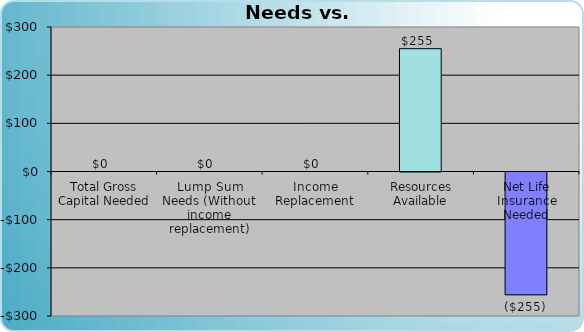
| Category | Series 0 |
|---|---|
| Total Gross Capital Needed | 0 |
| Lump Sum Needs (Without income replacement) | 0 |
| Income Replacement | 0 |
| Resources Available | 255 |
| Net Life Insurance Needed | -255 |